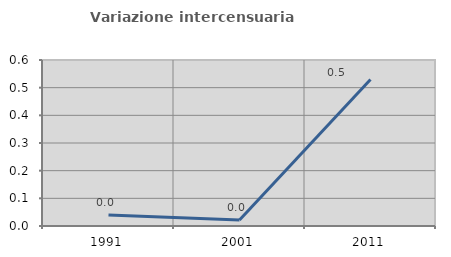
| Category | Variazione intercensuaria annua |
|---|---|
| 1991.0 | 0.04 |
| 2001.0 | 0.022 |
| 2011.0 | 0.529 |